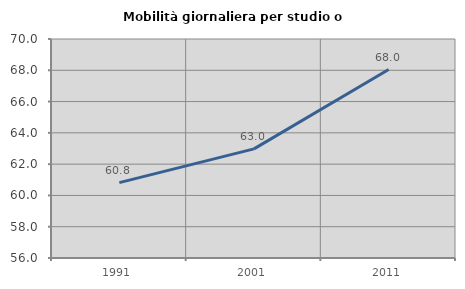
| Category | Mobilità giornaliera per studio o lavoro |
|---|---|
| 1991.0 | 60.821 |
| 2001.0 | 62.976 |
| 2011.0 | 68.047 |